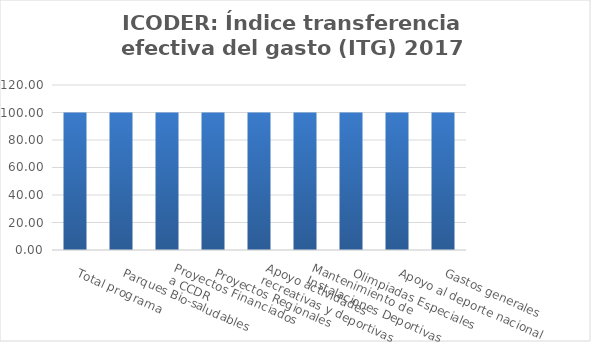
| Category | Índice transferencia efectiva del gasto (ITG) |
|---|---|
| Total programa | 100 |
| Parques Bio-saludables | 100 |
| Proyectos Financiados 
a CCDR | 100 |
| Proyectos Regionales  | 100 |
| Apoyo actividades 
recreativas y deportivas  | 100 |
| Mantenimiento de 
Instalaciones Deportivas  | 100 |
| Olimpiadas Especiales  | 100 |
| Apoyo al deporte nacional | 100 |
| Gastos generales | 100 |